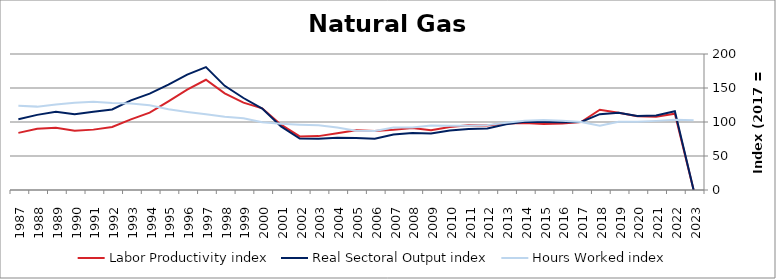
| Category | Labor Productivity index | Real Sectoral Output index | Hours Worked index |
|---|---|---|---|
| 2023.0 | 0 | 0 | 102.636 |
| 2022.0 | 112.283 | 115.872 | 103.196 |
| 2021.0 | 107.832 | 109.618 | 101.656 |
| 2020.0 | 108.385 | 108.942 | 100.513 |
| 2019.0 | 113.464 | 113.676 | 100.187 |
| 2018.0 | 118.008 | 111.567 | 94.542 |
| 2017.0 | 100 | 100 | 100 |
| 2016.0 | 97.877 | 99.521 | 101.679 |
| 2015.0 | 96.922 | 99.861 | 103.032 |
| 2014.0 | 98.517 | 100.194 | 101.703 |
| 2013.0 | 97.675 | 96.696 | 98.997 |
| 2012.0 | 94.689 | 90.337 | 95.405 |
| 2011.0 | 95.083 | 89.693 | 94.332 |
| 2010.0 | 92.578 | 87.589 | 94.612 |
| 2009.0 | 87.743 | 83.118 | 94.728 |
| 2008.0 | 91.011 | 83.729 | 91.999 |
| 2007.0 | 88.562 | 81.518 | 92.046 |
| 2006.0 | 86.921 | 75.303 | 86.633 |
| 2005.0 | 87.756 | 76.372 | 87.027 |
| 2004.0 | 83.364 | 76.738 | 92.052 |
| 2003.0 | 79.234 | 75.492 | 95.277 |
| 2002.0 | 78.725 | 75.611 | 96.044 |
| 2001.0 | 96.074 | 93.492 | 97.312 |
| 2000.0 | 120.184 | 119.771 | 99.656 |
| 1999.0 | 128.426 | 135.293 | 105.347 |
| 1998.0 | 142.178 | 153.18 | 107.739 |
| 1997.0 | 162.098 | 180.658 | 111.449 |
| 1996.0 | 147.644 | 169.57 | 114.85 |
| 1995.0 | 130.327 | 154.898 | 118.853 |
| 1994.0 | 113.807 | 141.727 | 124.533 |
| 1993.0 | 103.78 | 131.901 | 127.096 |
| 1992.0 | 92.593 | 118.505 | 127.985 |
| 1991.0 | 88.784 | 115.18 | 129.731 |
| 1990.0 | 87.028 | 111.586 | 128.218 |
| 1989.0 | 91.503 | 115.168 | 125.863 |
| 1988.0 | 90.095 | 110.468 | 122.614 |
| 1987.0 | 84.007 | 104.069 | 123.881 |